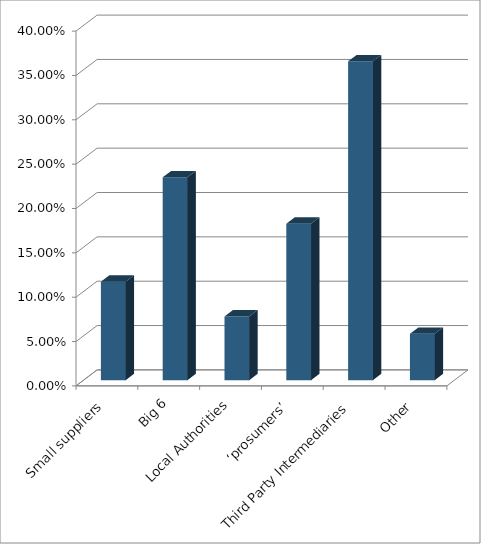
| Category | Series 0 |
|---|---|
| Small suppliers | 0.111 |
| Big 6 | 0.229 |
| Local Authorities | 0.072 |
| ‘prosumers’ | 0.176 |
| Third Party Intermediaries | 0.359 |
| Other | 0.052 |